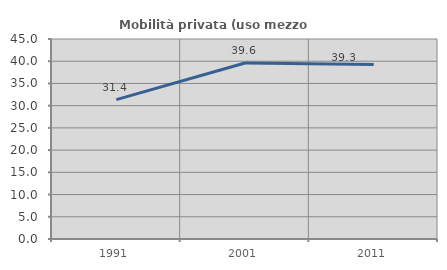
| Category | Mobilità privata (uso mezzo privato) |
|---|---|
| 1991.0 | 31.356 |
| 2001.0 | 39.603 |
| 2011.0 | 39.281 |